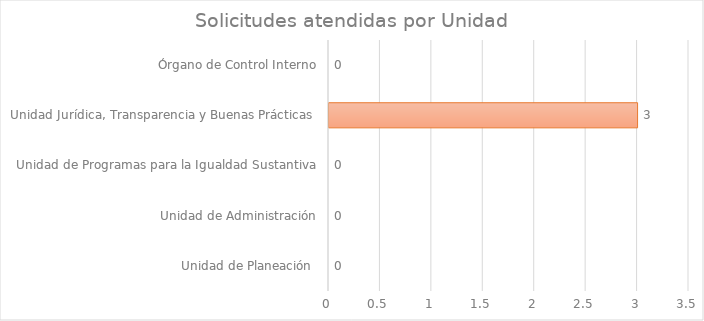
| Category | Series 1 |
|---|---|
| Unidad de Planeación  | 0 |
| Unidad de Administración | 0 |
| Unidad de Programas para la Igualdad Sustantiva | 0 |
| Unidad Jurídica, Transparencia y Buenas Prácticas  | 3 |
| Órgano de Control Interno | 0 |